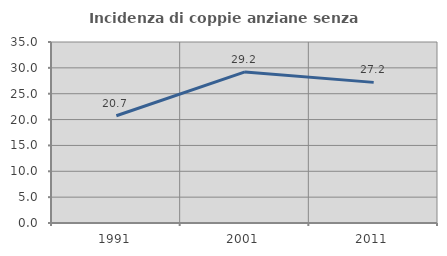
| Category | Incidenza di coppie anziane senza figli  |
|---|---|
| 1991.0 | 20.732 |
| 2001.0 | 29.221 |
| 2011.0 | 27.193 |